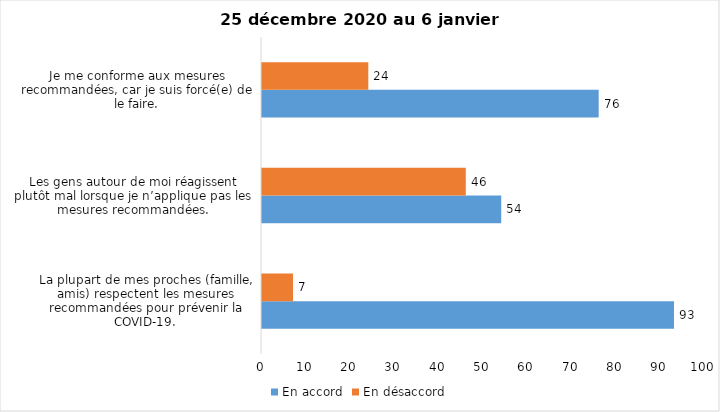
| Category | En accord | En désaccord |
|---|---|---|
| La plupart de mes proches (famille, amis) respectent les mesures recommandées pour prévenir la COVID-19. | 93 | 7 |
| Les gens autour de moi réagissent plutôt mal lorsque je n’applique pas les mesures recommandées. | 54 | 46 |
| Je me conforme aux mesures recommandées, car je suis forcé(e) de le faire. | 76 | 24 |